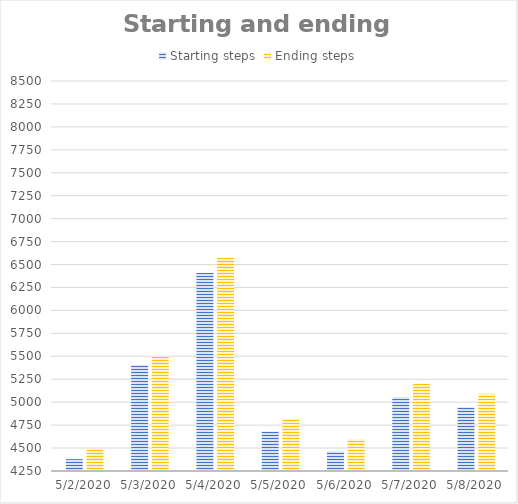
| Category | Starting steps | Ending steps |
|---|---|---|
| 5/2/20 | 4379 | 4481 |
| 5/3/20 | 5402 | 5510 |
| 5/4/20 | 6410 | 6573 |
| 5/5/20 | 4681 | 4819 |
| 5/6/20 | 4466 | 4596 |
| 5/7/20 | 5055 | 5203 |
| 5/8/20 | 4944 | 5092 |